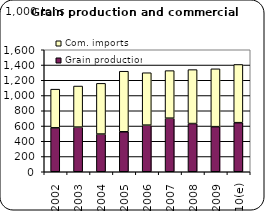
| Category | Grain production | Com. imports |
|---|---|---|
| 2002 | 576.177 | 507.134 |
| 2003 | 585.54 | 538.809 |
| 2004 | 494.449 | 665.012 |
| 2005 | 524.249 | 794.302 |
| 2006 | 611.437 | 687.299 |
| 2007 | 702.867 | 623.429 |
| 2008 | 632.18 | 707.533 |
| 2009 | 591.48 | 758.54 |
| 2010(e) | 643.84 | 763.057 |